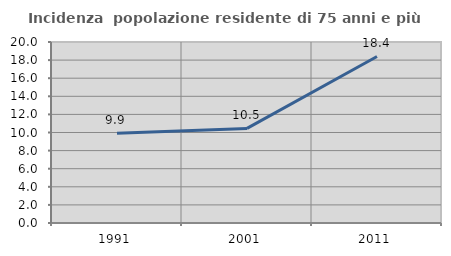
| Category | Incidenza  popolazione residente di 75 anni e più |
|---|---|
| 1991.0 | 9.921 |
| 2001.0 | 10.455 |
| 2011.0 | 18.399 |